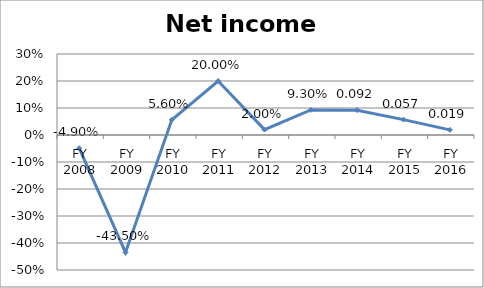
| Category | Net income ratio |
|---|---|
| FY 2016 | 0.019 |
| FY 2015 | 0.057 |
| FY 2014 | 0.092 |
| FY 2013 | 0.093 |
| FY 2012 | 0.02 |
| FY 2011 | 0.2 |
| FY 2010 | 0.056 |
| FY 2009 | -0.435 |
| FY 2008 | -0.049 |